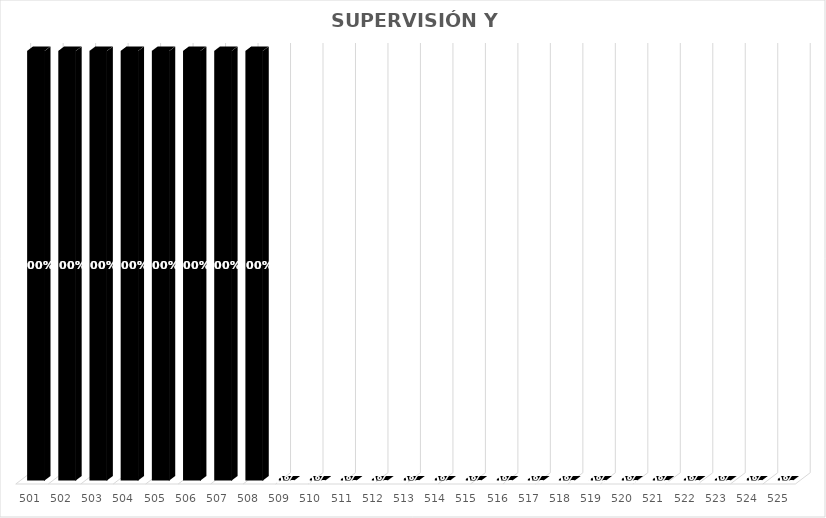
| Category | % Avance |
|---|---|
| 501.0 | 1 |
| 502.0 | 1 |
| 503.0 | 1 |
| 504.0 | 1 |
| 505.0 | 1 |
| 506.0 | 1 |
| 507.0 | 1 |
| 508.0 | 1 |
| 509.0 | 0 |
| 510.0 | 0 |
| 511.0 | 0 |
| 512.0 | 0 |
| 513.0 | 0 |
| 514.0 | 0 |
| 515.0 | 0 |
| 516.0 | 0 |
| 517.0 | 0 |
| 518.0 | 0 |
| 519.0 | 0 |
| 520.0 | 0 |
| 521.0 | 0 |
| 522.0 | 0 |
| 523.0 | 0 |
| 524.0 | 0 |
| 525.0 | 0 |